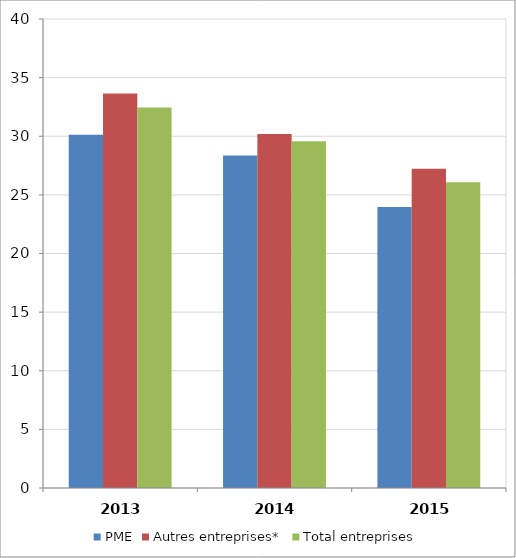
| Category | PME | Autres entreprises* | Total entreprises |
|---|---|---|---|
| 2013 | 30.136 | 33.647 | 32.454 |
| 2014 | 28.36 | 30.199 | 29.584 |
| 2015 | 23.969 | 27.227 | 26.084 |